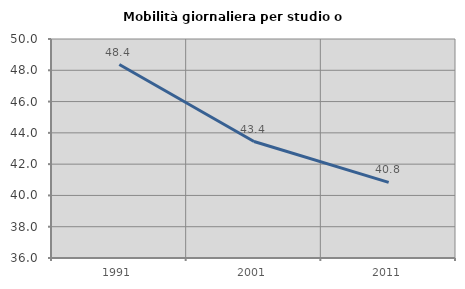
| Category | Mobilità giornaliera per studio o lavoro |
|---|---|
| 1991.0 | 48.368 |
| 2001.0 | 43.446 |
| 2011.0 | 40.836 |